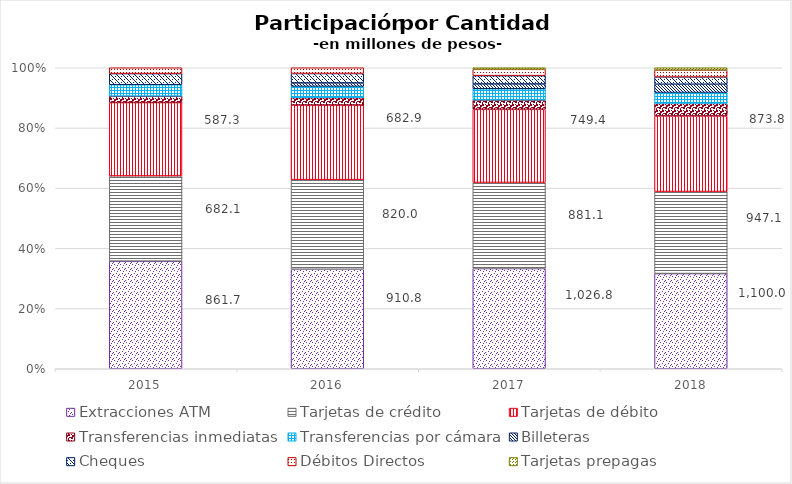
| Category | Extracciones ATM | Tarjetas de crédito | Tarjetas de débito | Transferencias inmediatas | Transferencias por cámara | Billeteras | Cheques | Débitos Directos | Tarjetas prepagas |
|---|---|---|---|---|---|---|---|---|---|
| 2015.0 | 861.697 | 682.083 | 587.264 | 51.491 | 91.051 | 0 | 89.05 | 46.792 | 0 |
| 2016.0 | 910.797 | 820.027 | 682.858 | 67.569 | 103.675 | 31.169 | 86.306 | 52.718 | 0 |
| 2017.0 | 1026.836 | 881.059 | 749.423 | 94.525 | 116.178 | 48.979 | 85.421 | 64.59 | 16.071 |
| 2018.0 | 1100.044 | 947.104 | 873.82 | 143.86 | 126.239 | 95.754 | 83.336 | 79.889 | 26.858 |